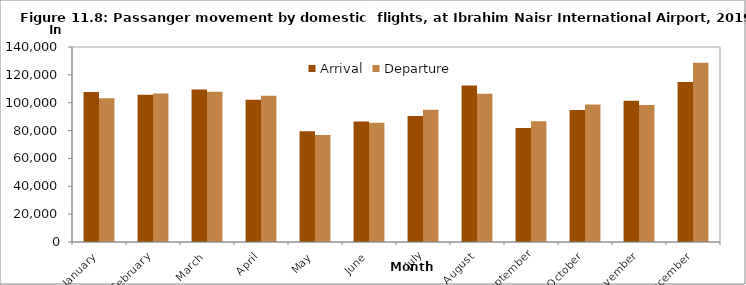
| Category | Arrival | Departure |
|---|---|---|
| January | 107622 | 103171 |
| February | 105630 | 106601 |
| March | 109464 | 107788 |
| April | 102150 | 104997 |
| May | 79579 | 76738 |
| June | 86442 | 85562 |
| July | 90383 | 94957 |
| August | 112311 | 106403 |
| September | 81780 | 86694 |
| October | 94716 | 98690 |
| November | 101425 | 98426 |
| December | 114946 | 128623 |